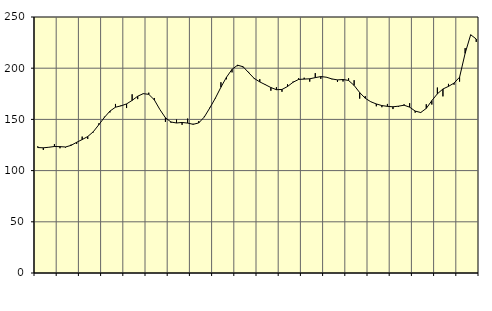
| Category | Piggar | Series 1 |
|---|---|---|
| nan | 123.7 | 122.5 |
| 1.0 | 120.2 | 122.26 |
| 1.0 | 122.8 | 122.79 |
| 1.0 | 125.9 | 123.54 |
| nan | 121.8 | 123.4 |
| 2.0 | 122.5 | 123.05 |
| 2.0 | 125.4 | 124.64 |
| 2.0 | 126.1 | 127.61 |
| nan | 133.2 | 130.32 |
| 3.0 | 130.9 | 133.26 |
| 3.0 | 137.3 | 137.93 |
| 3.0 | 146.1 | 144.79 |
| nan | 152.6 | 151.93 |
| 4.0 | 156.8 | 158.08 |
| 4.0 | 165.1 | 161.92 |
| 4.0 | 163.7 | 163.23 |
| nan | 161.1 | 165.12 |
| 5.0 | 174.5 | 168.56 |
| 5.0 | 169.8 | 172.62 |
| 5.0 | 175.4 | 175.14 |
| nan | 176.1 | 174.48 |
| 6.0 | 170.9 | 169.08 |
| 6.0 | 159.6 | 159.63 |
| 6.0 | 147.5 | 151.57 |
| nan | 146.8 | 147.47 |
| 7.0 | 149.9 | 146.49 |
| 7.0 | 144.7 | 147.03 |
| 7.0 | 150.8 | 146.4 |
| nan | 145.7 | 145.19 |
| 8.0 | 148.3 | 146.56 |
| 8.0 | 152.7 | 152.31 |
| 8.0 | 161.5 | 161.21 |
| nan | 170.4 | 170.77 |
| 9.0 | 186.3 | 181.45 |
| 9.0 | 189.2 | 191.17 |
| 9.0 | 195.9 | 198.88 |
| nan | 202 | 202.94 |
| 10.0 | 200.8 | 201.42 |
| 10.0 | 196.4 | 195.61 |
| 10.0 | 189.4 | 190 |
| nan | 189.3 | 186.62 |
| 11.0 | 184.3 | 183.92 |
| 11.0 | 178 | 181.12 |
| 11.0 | 181.4 | 179.01 |
| nan | 177 | 179.23 |
| 12.0 | 184.3 | 182.12 |
| 12.0 | 186.9 | 186.29 |
| 12.0 | 190.2 | 189.03 |
| nan | 190.7 | 189.37 |
| 13.0 | 186.9 | 189.66 |
| 13.0 | 195.2 | 190.79 |
| 13.0 | 189.6 | 191.82 |
| nan | 191 | 191.2 |
| 14.0 | 189.2 | 189.5 |
| 14.0 | 186.6 | 188.57 |
| 14.0 | 187 | 188.95 |
| nan | 190.2 | 188.03 |
| 15.0 | 188.3 | 183.17 |
| 15.0 | 170.3 | 176.22 |
| 15.0 | 172.7 | 170.67 |
| nan | 167.4 | 167.25 |
| 16.0 | 162.8 | 165.07 |
| 16.0 | 161.9 | 163.51 |
| 16.0 | 165.1 | 162.72 |
| nan | 160.1 | 162.32 |
| 17.0 | 162.3 | 162.93 |
| 17.0 | 164.7 | 163.85 |
| 17.0 | 165.8 | 161.96 |
| nan | 156.6 | 158.13 |
| 18.0 | 157.1 | 156.71 |
| 18.0 | 164.8 | 160.74 |
| 18.0 | 164.5 | 168.3 |
| nan | 181.1 | 174.99 |
| 19.0 | 172.5 | 179.69 |
| 19.0 | 184.7 | 182.24 |
| 19.0 | 183.9 | 185.45 |
| nan | 186.9 | 191.21 |
| 20.0 | 219.6 | 214.51 |
| 20.0 | 232.5 | 232.67 |
| 20.0 | 225.7 | 228.51 |